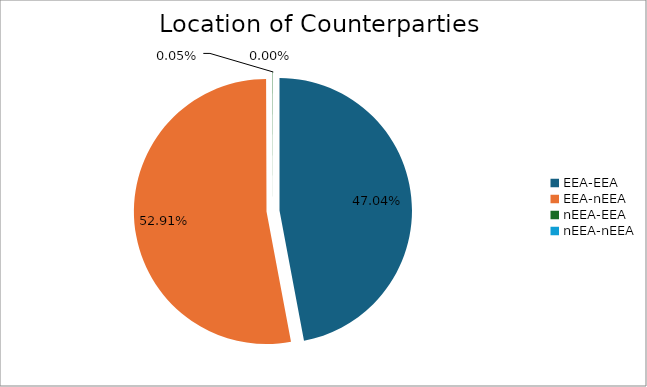
| Category | Series 0 |
|---|---|
| EEA-EEA | 5626551.126 |
| EEA-nEEA | 6328745.541 |
| nEEA-EEA | 5837.008 |
| nEEA-nEEA | 48.435 |